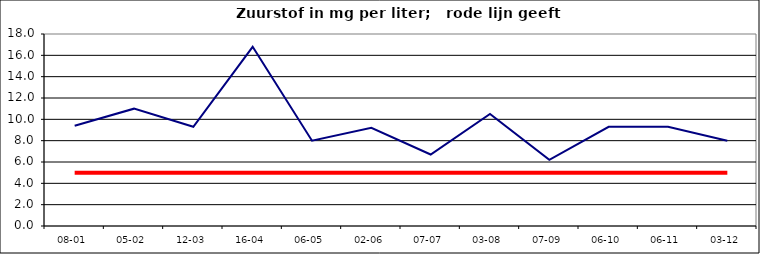
| Category | Series 0 | Series 1 |
|---|---|---|
| 08-01 | 9.4 | 5 |
| 05-02 | 11 | 5 |
| 12-03 | 9.3 | 5 |
| 16-04 | 16.8 | 5 |
| 06-05 | 8 | 5 |
| 02-06 | 9.2 | 5 |
| 07-07 | 6.7 | 5 |
| 03-08 | 10.5 | 5 |
| 07-09 | 6.2 | 5 |
| 06-10 | 9.3 | 5 |
| 06-11 | 9.3 | 5 |
| 03-12 | 8 | 5 |